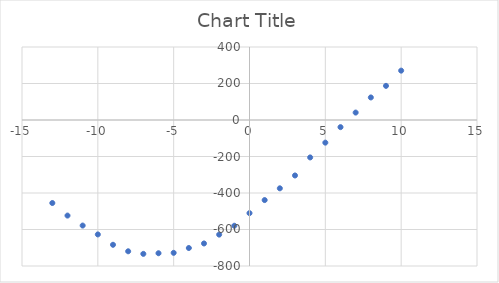
| Category | Series 0 |
|---|---|
| 10.0 | 270.471 |
| 9.0 | 187.052 |
| 8.0 | 123.548 |
| 7.0 | 40.727 |
| 6.0 | -39.088 |
| 5.0 | -124.047 |
| 4.0 | -205.082 |
| 3.0 | -303.959 |
| 2.0 | -374.321 |
| 1.0 | -438.749 |
| 0.0 | -510.413 |
| -1.0 | -579.386 |
| -2.0 | -628.054 |
| -3.0 | -676.508 |
| -4.0 | -701.441 |
| -5.0 | -727.928 |
| -6.0 | -730.051 |
| -7.0 | -733.544 |
| -8.0 | -719.381 |
| -9.0 | -683.714 |
| -10.0 | -626.98 |
| -11.0 | -578.39 |
| -12.0 | -523.706 |
| -13.0 | -454.92 |